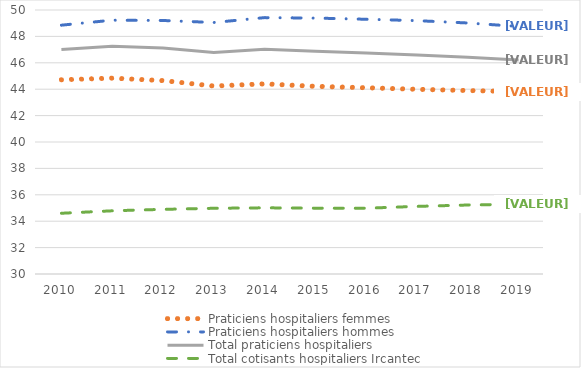
| Category | Praticiens hospitaliers femmes | Praticiens hospitaliers hommes | Total praticiens hospitaliers | Total cotisants hospitaliers Ircantec |
|---|---|---|---|---|
| 2010.0 | 44.714 | 48.85 | 47.004 | 34.601 |
| 2011.0 | 44.838 | 49.228 | 47.248 | 34.787 |
| 2012.0 | 44.651 | 49.205 | 47.114 | 34.898 |
| 2013.0 | 44.241 | 49.054 | 46.784 | 34.978 |
| 2014.0 | 44.404 | 49.423 | 47.02 | 35.014 |
| 2015.0 | 44.217 | 49.388 | 46.868 | 34.989 |
| 2016.0 | 44.11 | 49.299 | 46.736 | 34.983 |
| 2017.0 | 43.993 | 49.193 | 46.584 | 35.123 |
| 2018.0 | 43.898 | 49.016 | 46.421 | 35.226 |
| 2019.0 | 43.821 | 48.751 | 46.216 | 35.285 |